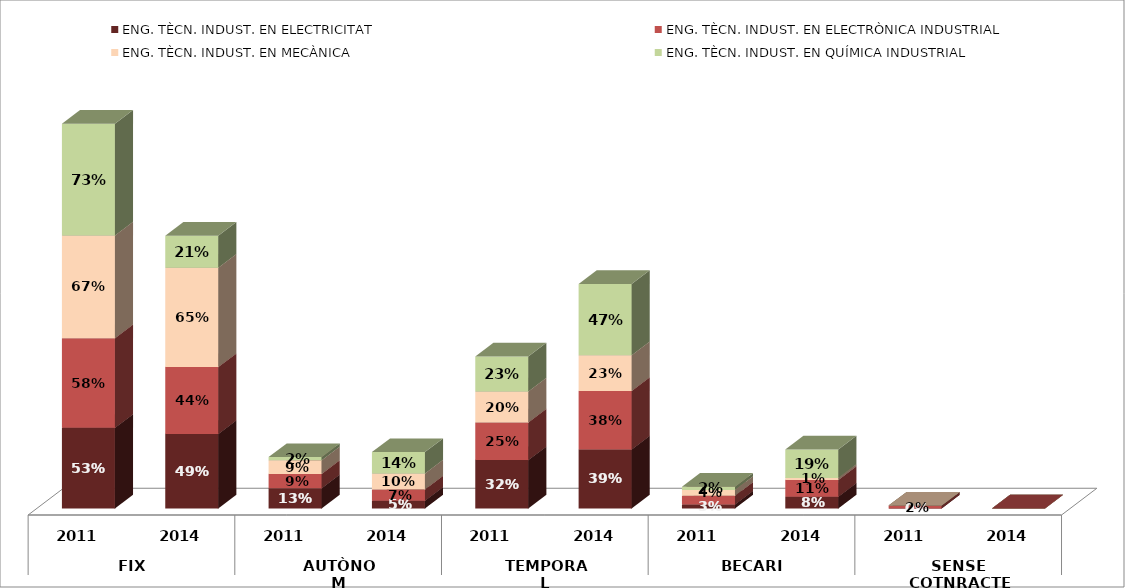
| Category | ENG. TÈCN. INDUST. EN ELECTRICITAT | ENG. TÈCN. INDUST. EN ELECTRÒNICA INDUSTRIAL | ENG. TÈCN. INDUST. EN MECÀNICA | ENG. TÈCN. INDUST. EN QUÍMICA INDUSTRIAL |
|---|---|---|---|---|
| 0 | 0.526 | 0.585 | 0.671 | 0.729 |
| 1 | 0.487 | 0.436 | 0.649 | 0.209 |
| 2 | 0.132 | 0.094 | 0.089 | 0.021 |
| 3 | 0.051 | 0.073 | 0.104 | 0.14 |
| 4 | 0.316 | 0.245 | 0.203 | 0.229 |
| 5 | 0.385 | 0.382 | 0.234 | 0.465 |
| 6 | 0.026 | 0.057 | 0.038 | 0.021 |
| 7 | 0.077 | 0.109 | 0.013 | 0.186 |
| 8 | 0 | 0.019 | 0 | 0 |
| 9 | 0 | 0 | 0 | 0 |